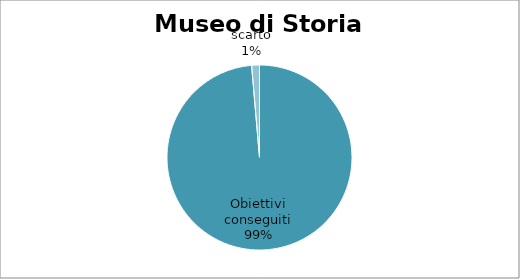
| Category | Series 0 |
|---|---|
| Obiettivi conseguiti | 98.636 |
| scarto | 1.364 |